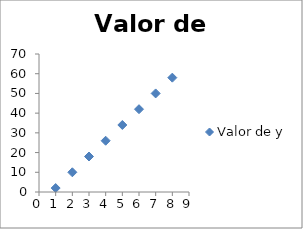
| Category | Valor de y |
|---|---|
| 1.0 | 2 |
| 2.0 | 10 |
| 3.0 | 18 |
| 4.0 | 26 |
| 5.0 | 34 |
| 6.0 | 42 |
| 7.0 | 50 |
| 8.0 | 58 |